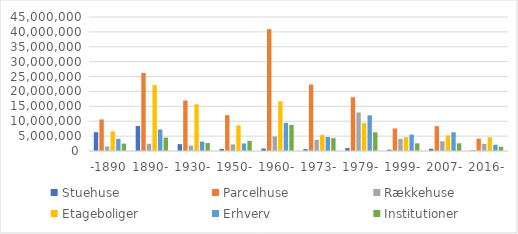
| Category | Stuehuse | Parcelhuse | Rækkehuse | Etageboliger | Erhverv | Institutioner |
|---|---|---|---|---|---|---|
| -1890 | 6310335 | 10592507 | 1532087 | 6606540 | 4030480 | 2478943 |
| 1890- | 8389928 | 26232234 | 2416151 | 22126208 | 7232309 | 4500655 |
| 1930- | 2299178 | 16972687 | 1795475 | 15679311 | 3175979 | 2676108 |
| 1950- | 727248 | 12030746 | 2213068 | 8622705 | 2524970 | 3409688 |
| 1960- | 842866 | 40932395 | 4910602 | 16677473 | 9465318 | 8744102 |
| 1973- | 619507 | 22312241 | 3759580 | 5356703 | 4697394 | 4303086 |
| 1979- | 973708 | 18060227 | 12933554 | 9365568 | 11980830 | 6293717 |
| 1999- | 464734 | 7574030 | 4084801 | 4631055 | 5503907 | 2561758 |
| 2007- | 729098 | 8340702 | 3273541 | 5231382 | 6284508 | 2574592 |
| 2016- | 213353 | 4156275 | 2401053 | 4623933 | 2116325 | 1417500 |